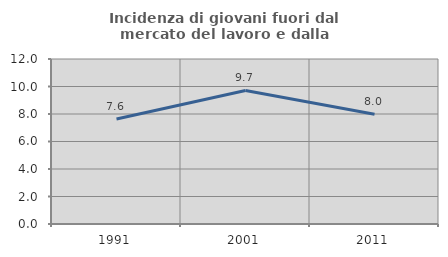
| Category | Incidenza di giovani fuori dal mercato del lavoro e dalla formazione  |
|---|---|
| 1991.0 | 7.642 |
| 2001.0 | 9.71 |
| 2011.0 | 7.976 |